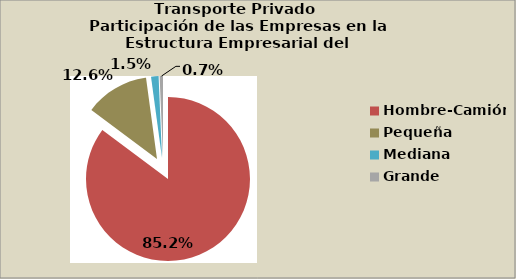
| Category | Series 0 |
|---|---|
| Hombre-Camión | 85.222 |
| Pequeña | 12.64 |
| Mediana | 1.477 |
| Grande | 0.661 |